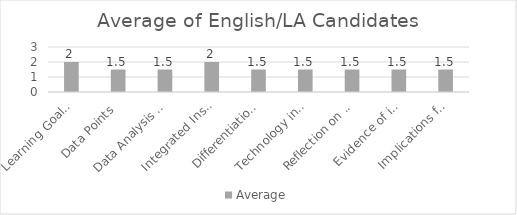
| Category | Average |
|---|---|
| Learning Goals Aligned with Pre-/Post-assessments ACEI 4.0 | 2 |
| Data Points | 1.5 |
| Data Analysis for Pedagogical Decisions ACEI 4.0 | 1.5 |
| Integrated Instruction ACEI 3.1 | 2 |
| Differentiation based on knowledge of individual learning ACEI 3.2 | 1.5 |
| Technology integration | 1.5 |
| Reflection on pedagogical decisions ACEI 1.0 | 1.5 |
| Evidence of impact on student learning ACEI 5.1 | 1.5 |
| Implications for teaching and professional development ACEI 5.1 | 1.5 |